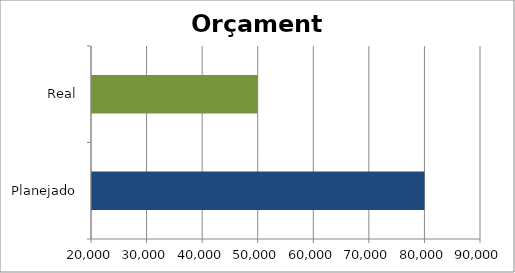
| Category | Series 0 |
|---|---|
| Planejado | 80000 |
| Real | 50000 |